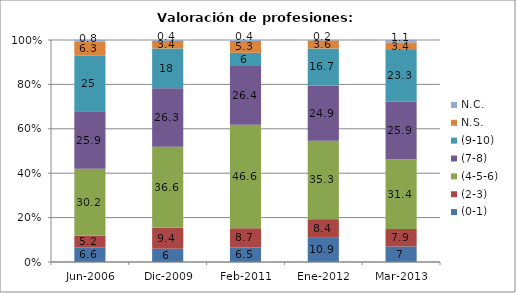
| Category | (0-1) | (2-3) | (4-5-6) | (7-8) | (9-10) | N.S. | N.C. |
|---|---|---|---|---|---|---|---|
| Jun-2006
  | 6.6 | 5.2 | 30.2 | 25.9 | 25 | 6.3 | 0.8 |
| Dic-2009
 | 6 | 9.4 | 36.6 | 26.3 | 18 | 3.4 | 0.4 |
| Feb-2011
 | 6.5 | 8.7 | 46.6 | 26.4 | 6 | 5.3 | 0.4 |
| Ene-2012
 | 10.9 | 8.4 | 35.3 | 24.9 | 16.7 | 3.6 | 0.2 |
| Mar-2013
 | 7 | 7.9 | 31.4 | 25.9 | 23.3 | 3.4 | 1.1 |